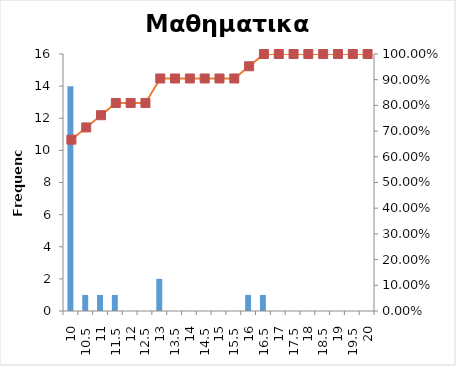
| Category | Series 0 |
|---|---|
| 10 | 14 |
| 10,5 | 1 |
| 11 | 1 |
| 11,5 | 1 |
| 12 | 0 |
| 12,5 | 0 |
| 13 | 2 |
| 13,5 | 0 |
| 14 | 0 |
| 14,5 | 0 |
| 15 | 0 |
| 15,5 | 0 |
| 16 | 1 |
| 16,5 | 1 |
| 17 | 0 |
| 17,5 | 0 |
| 18 | 0 |
| 18,5 | 0 |
| 19 | 0 |
| 19,5 | 0 |
| 20 | 0 |